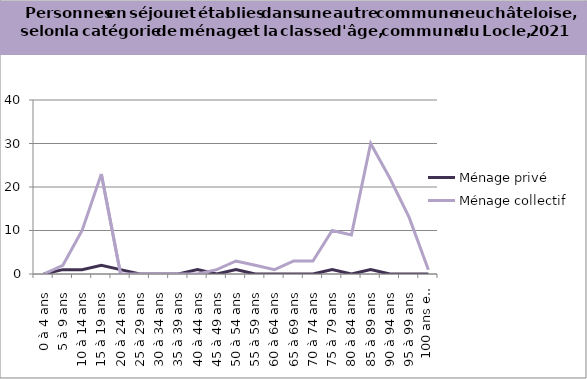
| Category | Ménage privé | Ménage collectif |
|---|---|---|
| 0 à 4 ans | 0 | 0 |
| 5 à 9 ans | 1 | 2 |
| 10 à 14 ans | 1 | 10 |
| 15 à 19 ans | 2 | 23 |
| 20 à 24 ans | 1 | 0 |
| 25 à 29 ans | 0 | 0 |
| 30 à 34 ans | 0 | 0 |
| 35 à 39 ans | 0 | 0 |
| 40 à 44 ans | 1 | 0 |
| 45 à 49 ans | 0 | 1 |
| 50 à 54 ans | 1 | 3 |
| 55 à 59 ans | 0 | 2 |
| 60 à 64 ans | 0 | 1 |
| 65 à 69 ans | 0 | 3 |
| 70 à 74 ans | 0 | 3 |
| 75 à 79 ans | 1 | 10 |
| 80 à 84 ans | 0 | 9 |
| 85 à 89 ans | 1 | 30 |
| 90 à 94 ans | 0 | 22 |
| 95 à 99 ans | 0 | 13 |
| 100 ans et plus | 0 | 1 |